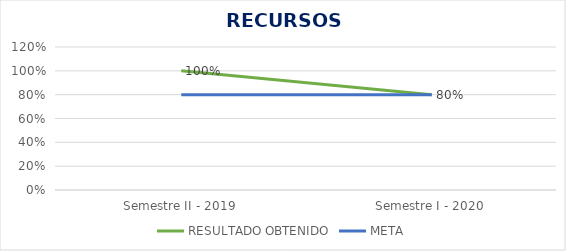
| Category | RESULTADO OBTENIDO | META |
|---|---|---|
| Semestre II - 2019 | 1 | 0.8 |
| Semestre I - 2020 | 0.8 | 0.8 |